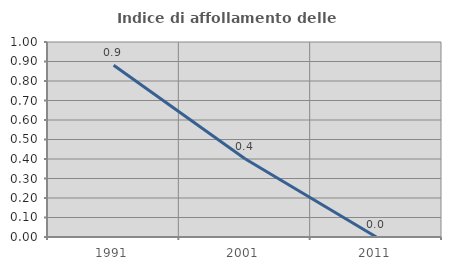
| Category | Indice di affollamento delle abitazioni  |
|---|---|
| 1991.0 | 0.881 |
| 2001.0 | 0.402 |
| 2011.0 | 0 |